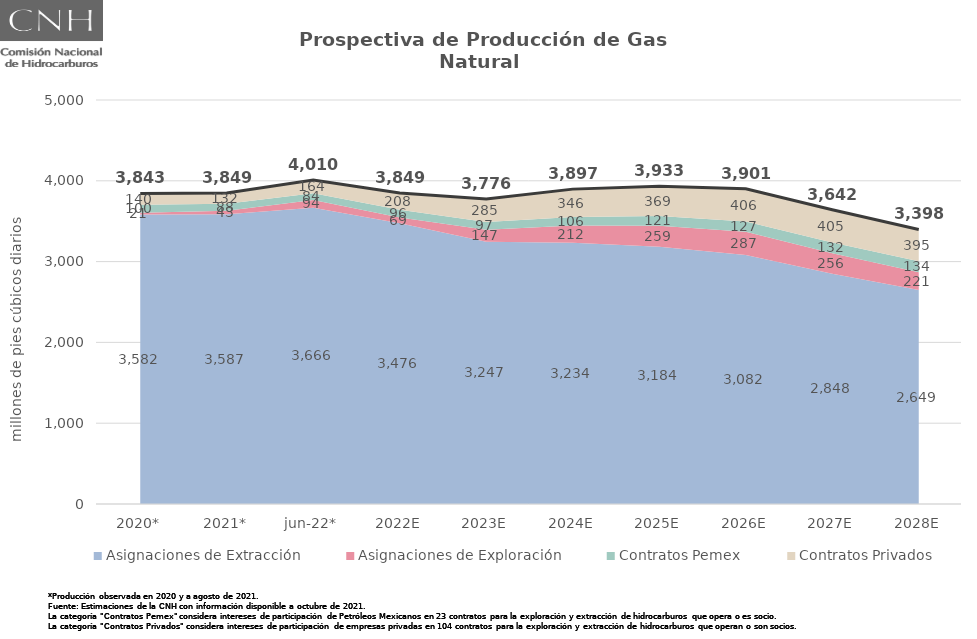
| Category | Total |
|---|---|
| 2020* | 3843.295 |
| 2021* | 3849.2 |
| jun-22* | 4009.858 |
| 2022E | 3848.935 |
| 2023E | 3775.744 |
| 2024E | 3896.974 |
| 2025E | 3933.194 |
| 2026E | 3900.728 |
| 2027E | 3642.284 |
| 2028E | 3398.065 |